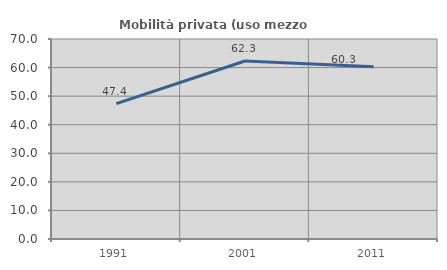
| Category | Mobilità privata (uso mezzo privato) |
|---|---|
| 1991.0 | 47.389 |
| 2001.0 | 62.293 |
| 2011.0 | 60.32 |